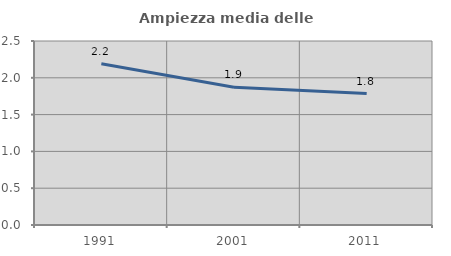
| Category | Ampiezza media delle famiglie |
|---|---|
| 1991.0 | 2.19 |
| 2001.0 | 1.872 |
| 2011.0 | 1.785 |